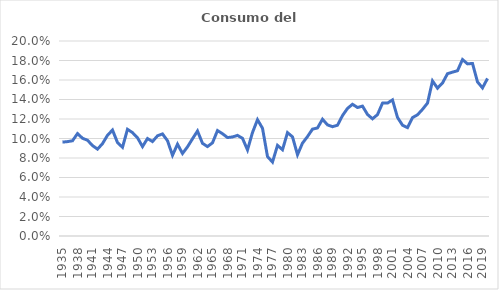
| Category | Del gobierno |
|---|---|
| 1935.0 | 0.096 |
| 1936.0 | 0.097 |
| 1937.0 | 0.098 |
| 1938.0 | 0.105 |
| 1939.0 | 0.1 |
| 1940.0 | 0.098 |
| 1941.0 | 0.093 |
| 1942.0 | 0.089 |
| 1943.0 | 0.095 |
| 1944.0 | 0.103 |
| 1945.0 | 0.109 |
| 1946.0 | 0.096 |
| 1947.0 | 0.091 |
| 1948.0 | 0.109 |
| 1949.0 | 0.106 |
| 1950.0 | 0.101 |
| 1951.0 | 0.092 |
| 1952.0 | 0.1 |
| 1953.0 | 0.097 |
| 1954.0 | 0.103 |
| 1955.0 | 0.105 |
| 1956.0 | 0.098 |
| 1957.0 | 0.083 |
| 1958.0 | 0.094 |
| 1959.0 | 0.085 |
| 1960.0 | 0.091 |
| 1961.0 | 0.1 |
| 1962.0 | 0.108 |
| 1963.0 | 0.095 |
| 1964.0 | 0.092 |
| 1965.0 | 0.096 |
| 1966.0 | 0.108 |
| 1967.0 | 0.105 |
| 1968.0 | 0.101 |
| 1969.0 | 0.102 |
| 1970.0 | 0.103 |
| 1971.0 | 0.1 |
| 1972.0 | 0.088 |
| 1973.0 | 0.106 |
| 1974.0 | 0.119 |
| 1975.0 | 0.11 |
| 1976.0 | 0.081 |
| 1977.0 | 0.076 |
| 1978.0 | 0.093 |
| 1979.0 | 0.088 |
| 1980.0 | 0.106 |
| 1981.0 | 0.102 |
| 1982.0 | 0.083 |
| 1983.0 | 0.095 |
| 1984.0 | 0.102 |
| 1985.0 | 0.11 |
| 1986.0 | 0.111 |
| 1987.0 | 0.12 |
| 1988.0 | 0.114 |
| 1989.0 | 0.112 |
| 1990.0 | 0.114 |
| 1991.0 | 0.124 |
| 1992.0 | 0.131 |
| 1993.0 | 0.135 |
| 1994.0 | 0.132 |
| 1995.0 | 0.133 |
| 1996.0 | 0.125 |
| 1997.0 | 0.12 |
| 1998.0 | 0.124 |
| 1999.0 | 0.136 |
| 2000.0 | 0.136 |
| 2001.0 | 0.14 |
| 2002.0 | 0.122 |
| 2003.0 | 0.114 |
| 2004.0 | 0.111 |
| 2005.0 | 0.121 |
| 2006.0 | 0.124 |
| 2007.0 | 0.13 |
| 2008.0 | 0.136 |
| 2009.0 | 0.159 |
| 2010.0 | 0.152 |
| 2011.0 | 0.157 |
| 2012.0 | 0.166 |
| 2013.0 | 0.168 |
| 2014.0 | 0.169 |
| 2015.0 | 0.181 |
| 2016.0 | 0.177 |
| 2017.0 | 0.177 |
| 2018.0 | 0.158 |
| 2019.0 | 0.152 |
| 2020.0 | 0.162 |